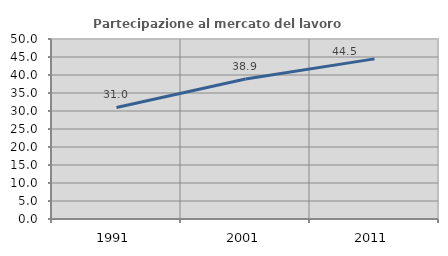
| Category | Partecipazione al mercato del lavoro  femminile |
|---|---|
| 1991.0 | 30.994 |
| 2001.0 | 38.871 |
| 2011.0 | 44.482 |